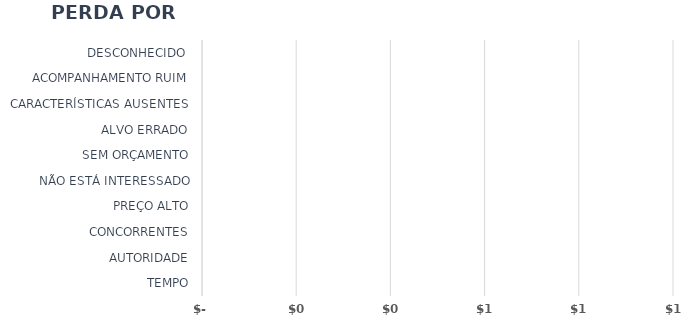
| Category | Series 1 |
|---|---|
| TEMPO | 0 |
| AUTORIDADE | 0 |
| CONCORRENTES | 0 |
| PREÇO ALTO | 0 |
| NÃO ESTÁ INTERESSADO | 0 |
| SEM ORÇAMENTO | 0 |
| ALVO ERRADO | 0 |
| CARACTERÍSTICAS AUSENTES | 0 |
| ACOMPANHAMENTO RUIM | 0 |
| DESCONHECIDO  | 0 |